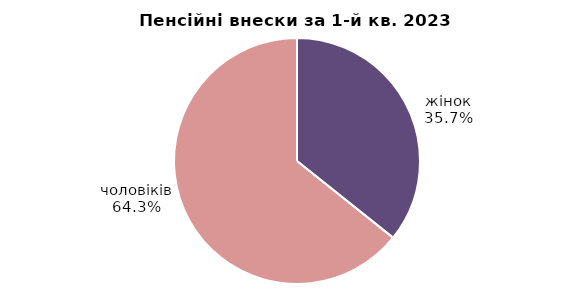
| Category | Series 0 |
|---|---|
| жінок | 10.758 |
| чоловіків | 19.358 |